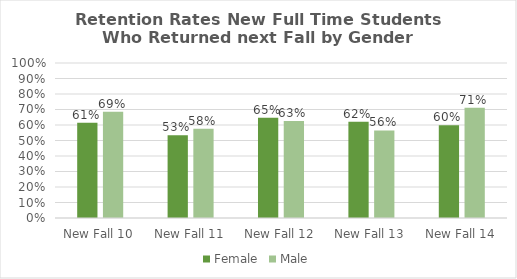
| Category | Female | Male |
|---|---|---|
| New Fall 10 | 0.615 | 0.686 |
| New Fall 11 | 0.534 | 0.575 |
| New Fall 12 | 0.647 | 0.626 |
| New Fall 13 | 0.62 | 0.565 |
| New Fall 14 | 0.599 | 0.712 |